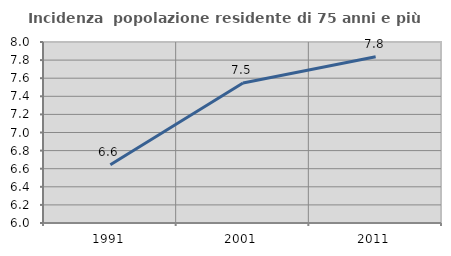
| Category | Incidenza  popolazione residente di 75 anni e più |
|---|---|
| 1991.0 | 6.644 |
| 2001.0 | 7.547 |
| 2011.0 | 7.837 |